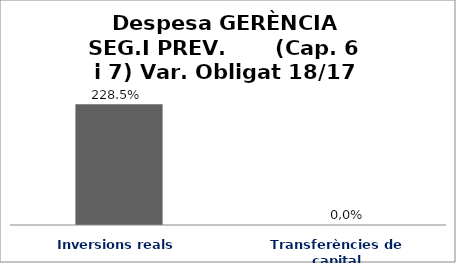
| Category | Series 0 |
|---|---|
| Inversions reals | 2.285 |
| Transferències de capital | 0 |